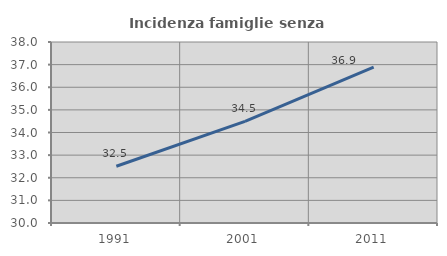
| Category | Incidenza famiglie senza nuclei |
|---|---|
| 1991.0 | 32.508 |
| 2001.0 | 34.492 |
| 2011.0 | 36.895 |